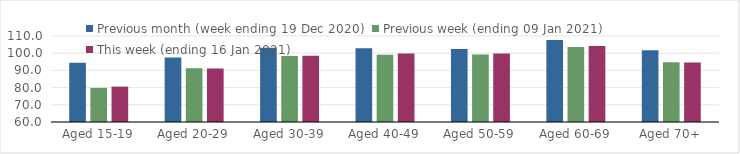
| Category | Previous month (week ending 19 Dec 2020) | Previous week (ending 09 Jan 2021) | This week (ending 16 Jan 2021) |
|---|---|---|---|
| Aged 15-19 | 94.4 | 79.83 | 80.58 |
| Aged 20-29 | 97.52 | 91.23 | 91.08 |
| Aged 30-39 | 103.19 | 98.4 | 98.5 |
| Aged 40-49 | 102.89 | 99.05 | 99.77 |
| Aged 50-59 | 102.45 | 99.27 | 99.85 |
| Aged 60-69 | 107.72 | 103.64 | 104.14 |
| Aged 70+ | 101.69 | 94.69 | 94.61 |